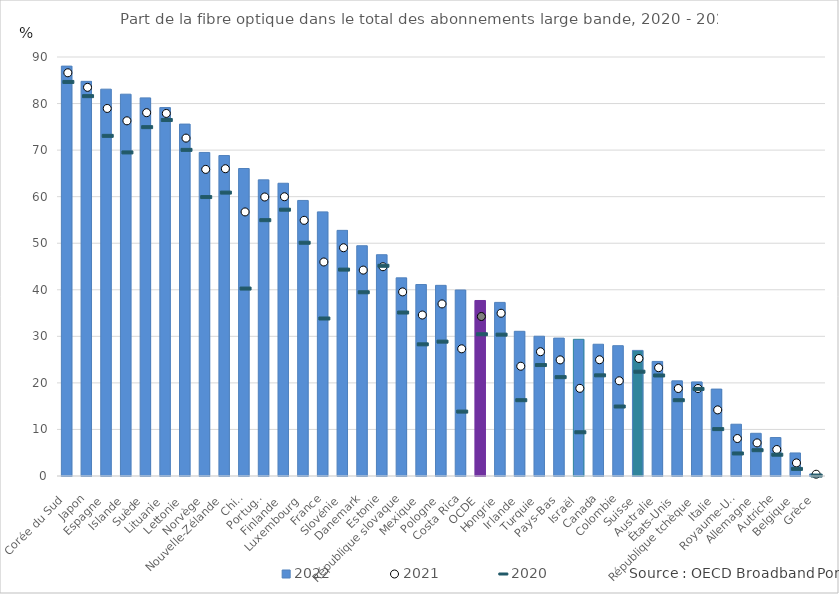
| Category | 2022 |
|---|---|
| Corée du Sud | 88.04 |
| Japon | 84.77 |
| Espagne | 83.09 |
| Islande | 82.01 |
| Suède | 81.22 |
| Lituanie | 79.14 |
| Lettonie | 75.59 |
| Norvège | 69.5 |
| Nouvelle-Zélande | 68.83 |
| Chili | 66.05 |
| Portugal | 63.61 |
| Finlande | 62.88 |
| Luxembourg | 59.19 |
| France | 56.73 |
| Slovénie | 52.76 |
| Danemark | 49.46 |
| Estonie | 47.53 |
| République slovaque | 42.56 |
| Mexique | 41.13 |
| Pologne | 40.95 |
| Costa Rica | 39.95 |
| OCDE | 37.7 |
| Hongrie | 37.29 |
| Irlande | 31.08 |
| Turquie | 30.02 |
| Pays-Bas | 29.62 |
| Israël | 29.36 |
| Canada | 28.3 |
| Colombie | 27.99 |
| Suisse | 26.98 |
| Australie | 24.61 |
| États-Unis | 20.44 |
| République tchèque | 20.21 |
| Italie | 18.67 |
| Royaume-Uni | 11.12 |
| Allemagne | 9.17 |
| Autriche | 8.26 |
| Belgique | 4.95 |
| Grèce | 0.44 |